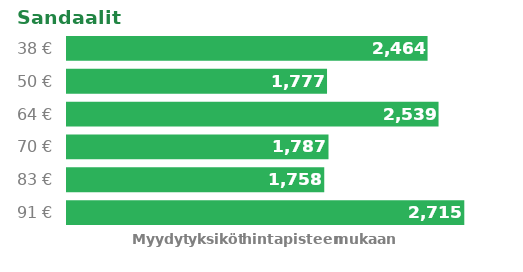
| Category | Series 0 |
|---|---|
| 38.0 | 2464 |
| 50.0 | 1777 |
| 64.0 | 2539 |
| 70.0 | 1787 |
| 83.0 | 1758 |
| 91.0 | 2715 |